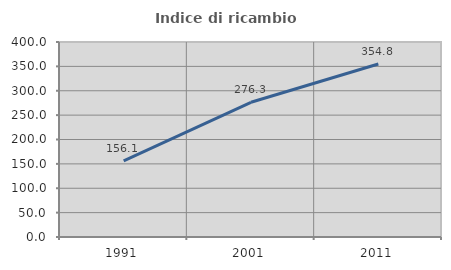
| Category | Indice di ricambio occupazionale  |
|---|---|
| 1991.0 | 156.15 |
| 2001.0 | 276.331 |
| 2011.0 | 354.762 |